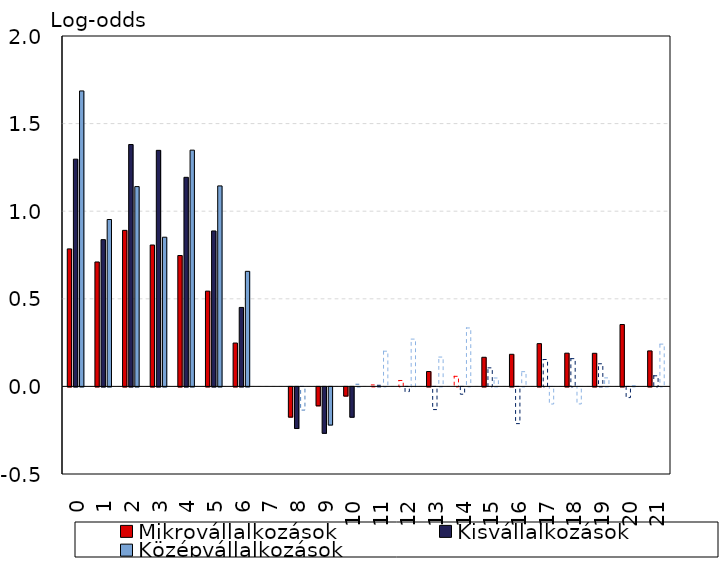
| Category | Mikrovállalkozások | Kisvállalkozások | Középvállalkozások |
|---|---|---|---|
| 0.0 | 0.785 | 1.297 | 1.686 |
| 1.0 | 0.71 | 0.838 | 0.953 |
| 2.0 | 0.891 | 1.381 | 1.141 |
| 3.0 | 0.807 | 1.347 | 0.852 |
| 4.0 | 0.747 | 1.193 | 1.348 |
| 5.0 | 0.544 | 0.887 | 1.144 |
| 6.0 | 0.247 | 0.451 | 0.657 |
| 7.0 | 0 | 0 | 0 |
| 8.0 | -0.172 | -0.238 | -0.132 |
| 9.0 | -0.108 | -0.265 | -0.218 |
| 10.0 | -0.052 | -0.173 | 0.012 |
| 11.0 | 0.008 | 0.006 | 0.201 |
| 12.0 | 0.034 | -0.027 | 0.27 |
| 13.0 | 0.085 | -0.129 | 0.168 |
| 14.0 | 0.058 | -0.042 | 0.334 |
| 15.0 | 0.166 | 0.106 | 0.048 |
| 16.0 | 0.183 | -0.21 | 0.084 |
| 17.0 | 0.244 | 0.154 | -0.098 |
| 18.0 | 0.19 | 0.158 | -0.097 |
| 19.0 | 0.189 | 0.129 | 0.049 |
| 20.0 | 0.353 | -0.061 | 0.004 |
| 21.0 | 0.203 | 0.06 | 0.241 |